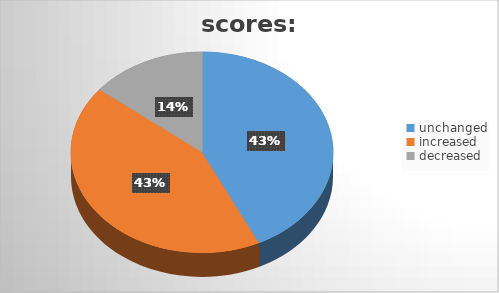
| Category | Series 0 |
|---|---|
| unchanged  | 3 |
| increased | 3 |
| decreased | 1 |